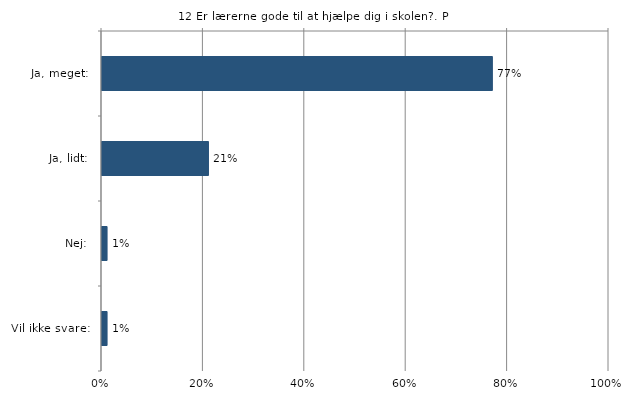
| Category | Er lærerne gode til at hjælpe dig i skolen? |
|---|---|
| Ja, meget:  | 0.77 |
| Ja, lidt:  | 0.21 |
| Nej:  | 0.01 |
| Vil ikke svare:  | 0.01 |